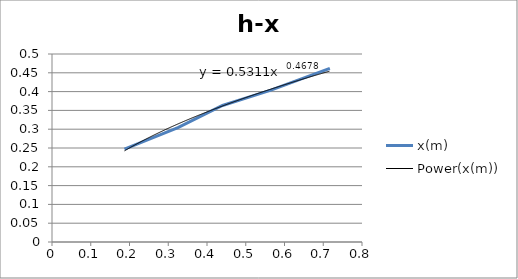
| Category | x(m) |
|---|---|
| 0.187 | 0.247 |
| 0.325 | 0.304 |
| 0.44 | 0.363 |
| 0.565 | 0.404 |
| 0.717 | 0.462 |